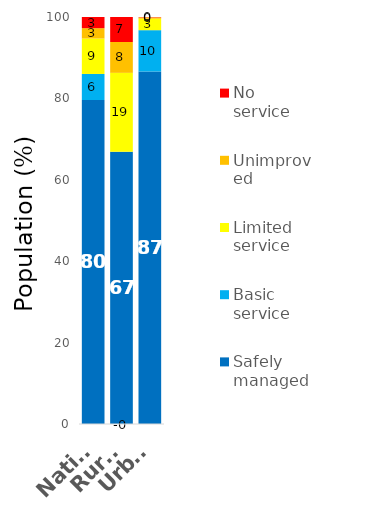
| Category | Safely managed | Basic service | Limited service | Unimproved | No service |
|---|---|---|---|---|---|
| National | 79.609 | 6.401 | 8.703 | 2.538 | 2.749 |
| Rural | 66.905 | -0.381 | 19.375 | 7.575 | 6.527 |
| Urban | 86.62 | 10.144 | 2.814 | 0.316 | 0.086 |